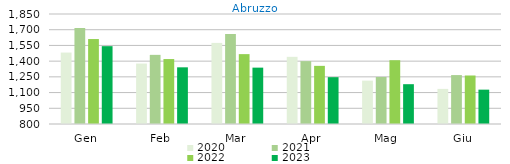
| Category | 2020 | 2021 | 2022 | 2023 |
|---|---|---|---|---|
| Gen | 1482 | 1717 | 1611 | 1543 |
| Feb | 1377 | 1460 | 1420 | 1341 |
| Mar | 1574 | 1660 | 1467 | 1338 |
| Apr | 1441 | 1400 | 1355 | 1247 |
| Mag | 1214 | 1249 | 1409 | 1180 |
| Giu | 1135 | 1267 | 1263 | 1127.87 |